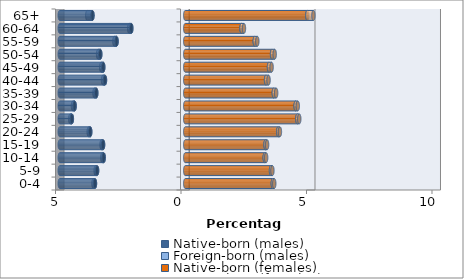
| Category | Native-born (males) | Foreign-born (males) | Native-born (females) | Foreign-born (females) |
|---|---|---|---|---|
| 0-4 | -3.597 | -0.06 | 3.489 | 0.057 |
| 5-9 | -3.513 | -0.057 | 3.417 | 0.056 |
| 10-14 | -3.25 | -0.056 | 3.166 | 0.057 |
| 15-19 | -3.275 | -0.06 | 3.197 | 0.063 |
| 20-24 | -3.785 | -0.061 | 3.703 | 0.069 |
| 25-29 | -4.518 | -0.064 | 4.465 | 0.078 |
| 30-34 | -4.408 | -0.067 | 4.398 | 0.085 |
| 35-39 | -3.545 | -0.071 | 3.528 | 0.094 |
| 40-44 | -3.199 | -0.076 | 3.219 | 0.1 |
| 45-49 | -3.267 | -0.082 | 3.336 | 0.104 |
| 50-54 | -3.386 | -0.086 | 3.458 | 0.105 |
| 55-59 | -2.737 | -0.085 | 2.769 | 0.102 |
| 60-64 | -2.15 | -0.083 | 2.241 | 0.098 |
| 65+ | -3.698 | -0.206 | 4.863 | 0.243 |